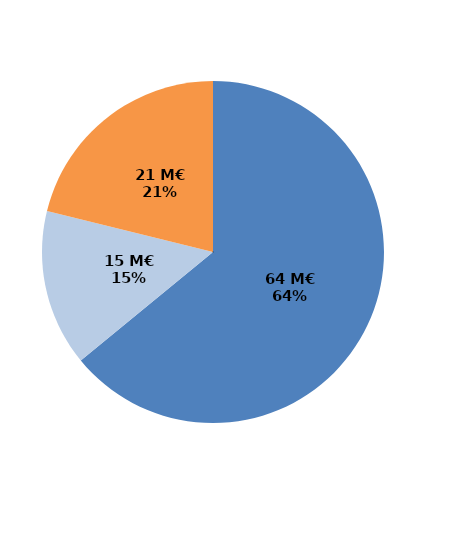
| Category | Series 0 |
|---|---|
| Formations certifiantes et pré-certifiantes | 63.578 |
| Formations professionnalisantes | 14.683 |
| Formations d'insertion sociale et professionnelle | 20.976 |